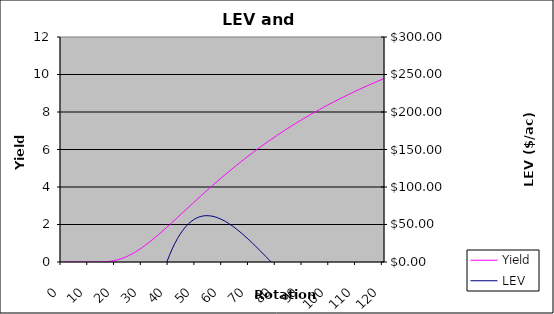
| Category | Yield |
|---|---|
| 0.0 | 0 |
| 1.0 | 0 |
| 2.0 | 0 |
| 3.0 | 0 |
| 4.0 | 0 |
| 5.0 | 0 |
| 6.0 | 0 |
| 7.0 | 0 |
| 8.0 | 0 |
| 9.0 | 0 |
| 10.0 | 0 |
| 11.0 | 0 |
| 12.0 | 0 |
| 13.0 | 0.001 |
| 14.0 | 0.003 |
| 15.0 | 0.006 |
| 16.0 | 0.013 |
| 17.0 | 0.024 |
| 18.0 | 0.041 |
| 19.0 | 0.063 |
| 20.0 | 0.093 |
| 21.0 | 0.13 |
| 22.0 | 0.174 |
| 23.0 | 0.227 |
| 24.0 | 0.287 |
| 25.0 | 0.354 |
| 26.0 | 0.429 |
| 27.0 | 0.51 |
| 28.0 | 0.598 |
| 29.0 | 0.692 |
| 30.0 | 0.791 |
| 31.0 | 0.895 |
| 32.0 | 1.003 |
| 33.0 | 1.116 |
| 34.0 | 1.232 |
| 35.0 | 1.351 |
| 36.0 | 1.473 |
| 37.0 | 1.597 |
| 38.0 | 1.723 |
| 39.0 | 1.851 |
| 40.0 | 1.98 |
| 41.0 | 2.111 |
| 42.0 | 2.242 |
| 43.0 | 2.374 |
| 44.0 | 2.506 |
| 45.0 | 2.638 |
| 46.0 | 2.771 |
| 47.0 | 2.903 |
| 48.0 | 3.035 |
| 49.0 | 3.167 |
| 50.0 | 3.298 |
| 51.0 | 3.428 |
| 52.0 | 3.558 |
| 53.0 | 3.687 |
| 54.0 | 3.815 |
| 55.0 | 3.942 |
| 56.0 | 4.068 |
| 57.0 | 4.193 |
| 58.0 | 4.318 |
| 59.0 | 4.44 |
| 60.0 | 4.562 |
| 61.0 | 4.683 |
| 62.0 | 4.802 |
| 63.0 | 4.92 |
| 64.0 | 5.037 |
| 65.0 | 5.152 |
| 66.0 | 5.267 |
| 67.0 | 5.38 |
| 68.0 | 5.492 |
| 69.0 | 5.602 |
| 70.0 | 5.711 |
| 71.0 | 5.819 |
| 72.0 | 5.926 |
| 73.0 | 6.031 |
| 74.0 | 6.135 |
| 75.0 | 6.238 |
| 76.0 | 6.34 |
| 77.0 | 6.44 |
| 78.0 | 6.539 |
| 79.0 | 6.637 |
| 80.0 | 6.734 |
| 81.0 | 6.83 |
| 82.0 | 6.924 |
| 83.0 | 7.017 |
| 84.0 | 7.109 |
| 85.0 | 7.2 |
| 86.0 | 7.29 |
| 87.0 | 7.379 |
| 88.0 | 7.466 |
| 89.0 | 7.553 |
| 90.0 | 7.638 |
| 91.0 | 7.723 |
| 92.0 | 7.806 |
| 93.0 | 7.888 |
| 94.0 | 7.97 |
| 95.0 | 8.05 |
| 96.0 | 8.129 |
| 97.0 | 8.208 |
| 98.0 | 8.285 |
| 99.0 | 8.362 |
| 100.0 | 8.437 |
| 101.0 | 8.512 |
| 102.0 | 8.585 |
| 103.0 | 8.658 |
| 104.0 | 8.73 |
| 105.0 | 8.801 |
| 106.0 | 8.872 |
| 107.0 | 8.941 |
| 108.0 | 9.01 |
| 109.0 | 9.078 |
| 110.0 | 9.145 |
| 111.0 | 9.211 |
| 112.0 | 9.276 |
| 113.0 | 9.341 |
| 114.0 | 9.405 |
| 115.0 | 9.468 |
| 116.0 | 9.531 |
| 117.0 | 9.592 |
| 118.0 | 9.653 |
| 119.0 | 9.714 |
| 120.0 | 9.773 |